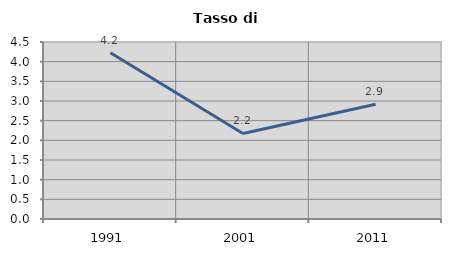
| Category | Tasso di disoccupazione   |
|---|---|
| 1991.0 | 4.225 |
| 2001.0 | 2.174 |
| 2011.0 | 2.917 |